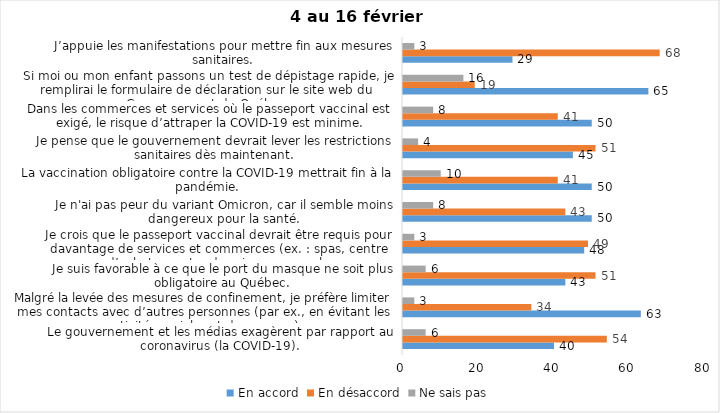
| Category | En accord | En désaccord | Ne sais pas |
|---|---|---|---|
| Le gouvernement et les médias exagèrent par rapport au coronavirus (la COVID-19). | 40 | 54 | 6 |
| Malgré la levée des mesures de confinement, je préfère limiter mes contacts avec d’autres personnes (par ex., en évitant les activités sociales et de groupes) | 63 | 34 | 3 |
| Je suis favorable à ce que le port du masque ne soit plus obligatoire au Québec. | 43 | 51 | 6 |
| Je crois que le passeport vaccinal devrait être requis pour davantage de services et commerces (ex. : spas, centre d’achats, centre de soins personnels. | 48 | 49 | 3 |
| Je n'ai pas peur du variant Omicron, car il semble moins dangereux pour la santé. | 50 | 43 | 8 |
| La vaccination obligatoire contre la COVID-19 mettrait fin à la pandémie. | 50 | 41 | 10 |
| Je pense que le gouvernement devrait lever les restrictions sanitaires dès maintenant. | 45 | 51 | 4 |
| Dans les commerces et services où le passeport vaccinal est exigé, le risque d’attraper la COVID-19 est minime. | 50 | 41 | 8 |
| Si moi ou mon enfant passons un test de dépistage rapide, je remplirai le formulaire de déclaration sur le site web du Gouvernement du Québec. | 65 | 19 | 16 |
| J’appuie les manifestations pour mettre fin aux mesures sanitaires. | 29 | 68 | 3 |